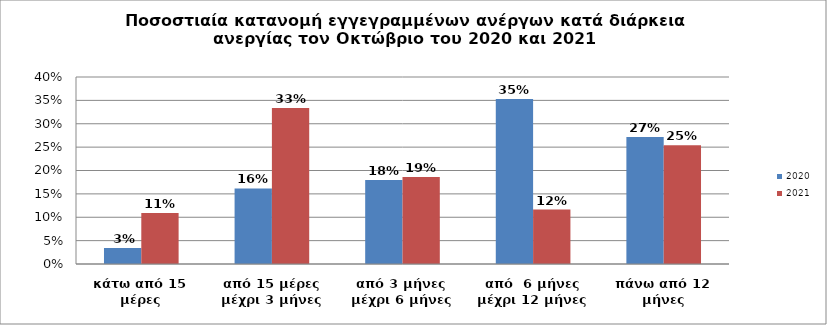
| Category | 2020 | 2021 |
|---|---|---|
| κάτω από 15 μέρες | 0.034 | 0.109 |
| από 15 μέρες μέχρι 3 μήνες | 0.162 | 0.334 |
| από 3 μήνες μέχρι 6 μήνες | 0.18 | 0.186 |
| από  6 μήνες μέχρι 12 μήνες | 0.353 | 0.117 |
| πάνω από 12 μήνες | 0.272 | 0.254 |